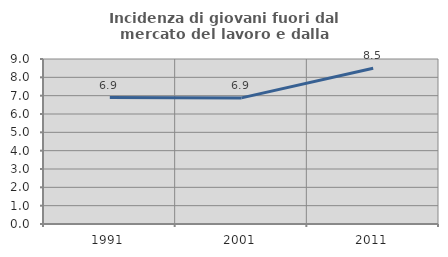
| Category | Incidenza di giovani fuori dal mercato del lavoro e dalla formazione  |
|---|---|
| 1991.0 | 6.897 |
| 2001.0 | 6.878 |
| 2011.0 | 8.497 |